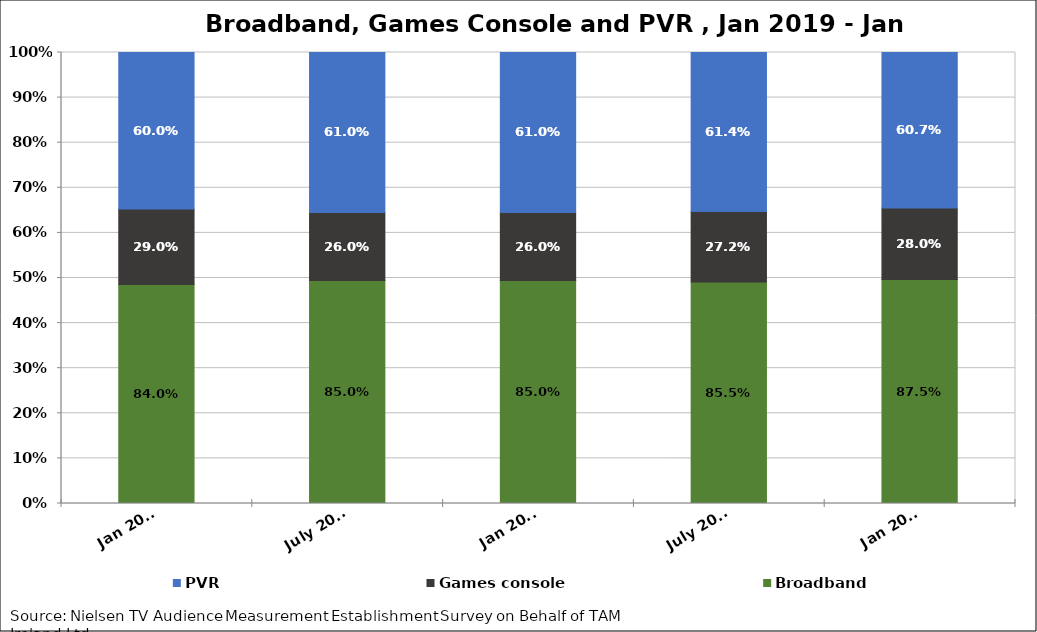
| Category | Broadband | Games console | PVR |
|---|---|---|---|
| Jan 2019 | 0.84 | 0.29 | 0.6 |
| July 2019 | 0.85 | 0.26 | 0.61 |
| Jan 2020 | 0.85 | 0.26 | 0.61 |
| July 2020 | 0.855 | 0.272 | 0.614 |
| Jan 2021 | 0.875 | 0.28 | 0.607 |